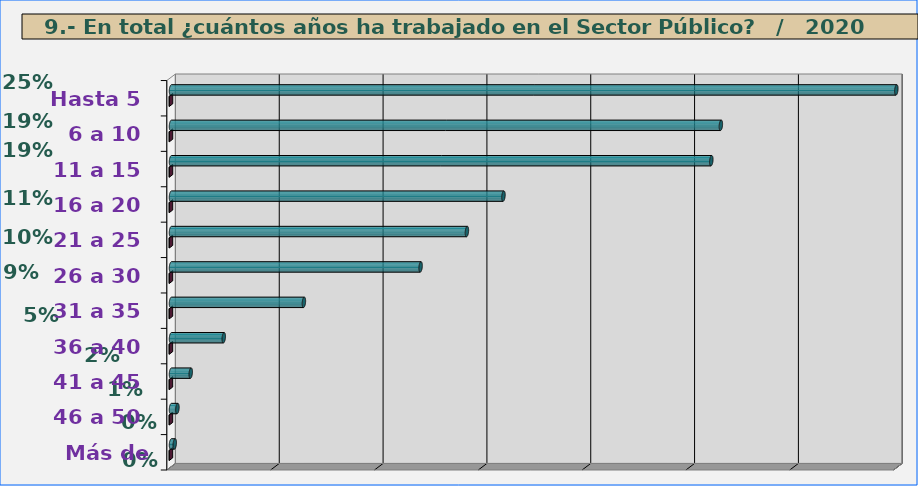
| Category | Series 0 | Series 1 |
|---|---|---|
| Hasta 5 | 3493 | 0.249 |
| 6 a 10 | 2648 | 0.189 |
| 11 a 15 | 2602 | 0.186 |
| 16 a 20 | 1601 | 0.114 |
| 21 a 25 | 1425 | 0.102 |
| 26 a 30 | 1202 | 0.086 |
| 31 a 35 | 640 | 0.046 |
| 36 a 40 | 254 | 0.018 |
| 41 a 45 | 95 | 0.007 |
| 46 a 50 | 31 | 0.002 |
| Más de 50 | 18 | 0.001 |